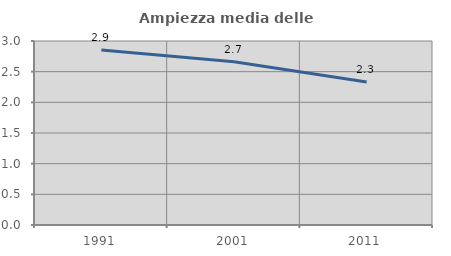
| Category | Ampiezza media delle famiglie |
|---|---|
| 1991.0 | 2.854 |
| 2001.0 | 2.663 |
| 2011.0 | 2.331 |